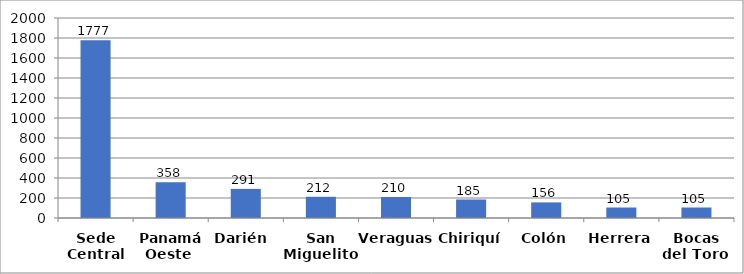
| Category | Series 0 |
|---|---|
| Sede Central | 1777 |
| Panamá Oeste  | 358 |
| Darién  | 291 |
| San Miguelito  | 212 |
| Veraguas | 210 |
| Chiriquí | 185 |
| Colón | 156 |
| Herrera | 105 |
| Bocas del Toro  | 105 |